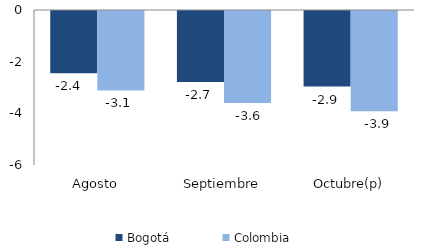
| Category | Bogotá | Colombia |
|---|---|---|
| Agosto | -2.413 | -3.077 |
| Septiembre | -2.748 | -3.562 |
| Octubre(p) | -2.926 | -3.879 |